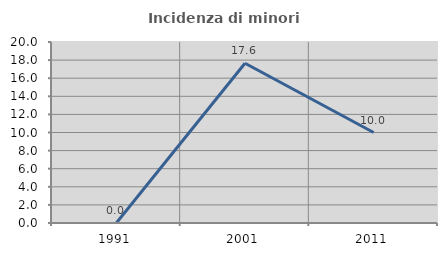
| Category | Incidenza di minori stranieri |
|---|---|
| 1991.0 | 0 |
| 2001.0 | 17.647 |
| 2011.0 | 10 |